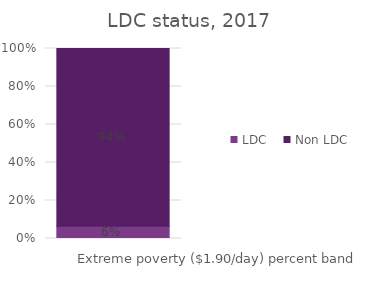
| Category | LDC | Non LDC |
|---|---|---|
| 0 | 0.065 | 0.935 |